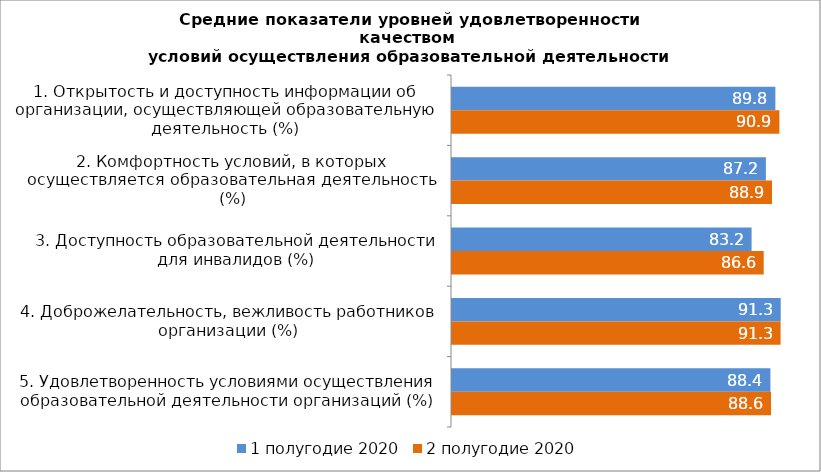
| Category | 1 полугодие 2020 | 2 полугодие 2020 |
|---|---|---|
| 1. Открытость и доступность информации об организации, осуществляющей образовательную деятельность (%) | 89.826 | 90.942 |
| 2. Комфортность условий, в которых осуществляется образовательная деятельность (%) | 87.191 | 88.893 |
| 3. Доступность образовательной деятельности для инвалидов (%) | 83.22 | 86.586 |
| 4. Доброжелательность, вежливость работников организации (%) | 91.307 | 91.278 |
| 5. Удовлетворенность условиями осуществления образовательной деятельности организаций (%) | 88.446 | 88.616 |